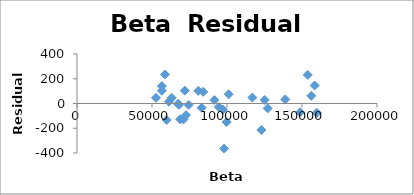
| Category | Series 0 |
|---|---|
| 59809.8 | -133.26 |
| 68769.3 | -127.891 |
| 70999.0 | -128.859 |
| 72702.1 | -93.605 |
| 68025.9 | -10.027 |
| 63147.4 | 45.524 |
| 56543.6 | 102.954 |
| 58627.5 | 234.56 |
| 56589.8 | 140.939 |
| 52678.7 | 46.283 |
| 61275.0 | 14.748 |
| 74517.4 | -11.629 |
| 67338.6 | -2.842 |
| 71881.3 | 103.737 |
| 84175.6 | 94.206 |
| 80859.3 | 102.179 |
| 83132.9 | -34.545 |
| 97323.7 | -49.797 |
| 98067.2 | -364.145 |
| 99746.4 | -150.412 |
| 94553.2 | -28.554 |
| 91574.3 | 27.669 |
| 101097.6 | 74.323 |
| 122921.6 | -213.644 |
| 116905.6 | 47.893 |
| 125131.9 | 28.587 |
| 127134.9 | -39.494 |
| 148723.6 | -70.825 |
| 138859.4 | 33.184 |
| 156176.2 | 61.44 |
| 153837.1 | 231.303 |
| 158444.1 | 145.256 |
| 159879.9 | -75.257 |